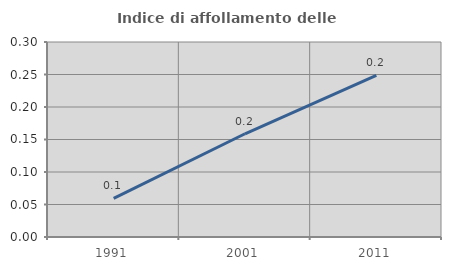
| Category | Indice di affollamento delle abitazioni  |
|---|---|
| 1991.0 | 0.059 |
| 2001.0 | 0.159 |
| 2011.0 | 0.249 |